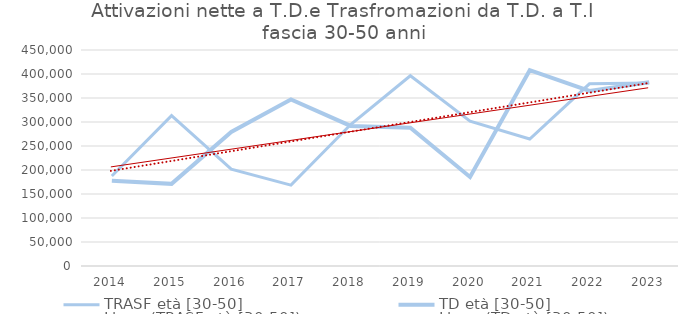
| Category | TRASF età [30-50] | TD età [30-50] |
|---|---|---|
| 2014.0 | 187362 | 177713 |
| 2015.0 | 313218 | 171162 |
| 2016.0 | 201722 | 279416 |
| 2017.0 | 168505 | 347116 |
| 2018.0 | 294646 | 291791 |
| 2019.0 | 396399 | 288221 |
| 2020.0 | 301804 | 185561 |
| 2021.0 | 264500 | 407915 |
| 2022.0 | 379514 | 364663 |
| 2023.0 | 381041 | 382660 |